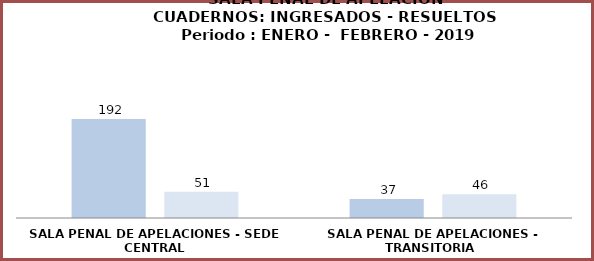
| Category | Series 0 | Series 1 |
|---|---|---|
| SALA PENAL DE APELACIONES - SEDE CENTRAL | 192 | 51 |
| SALA PENAL DE APELACIONES - TRANSITORIA  | 37 | 46 |